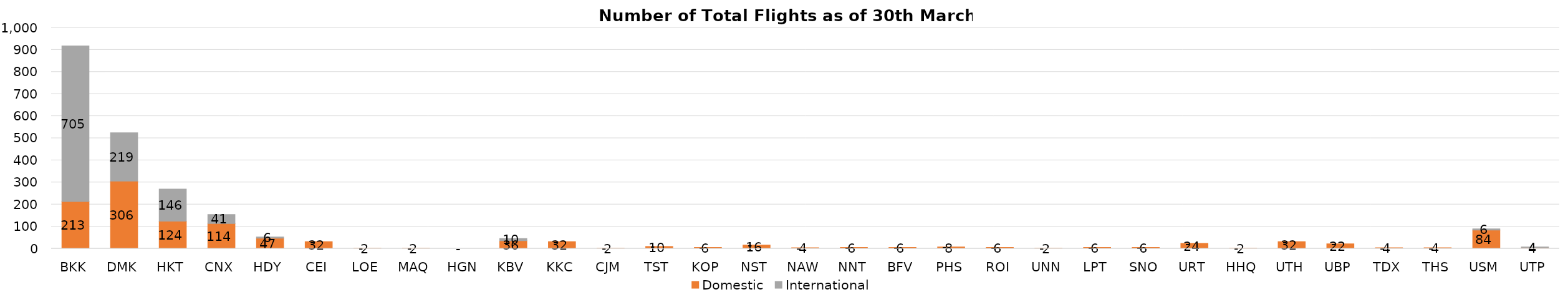
| Category | Domestic | International |
|---|---|---|
| BKK | 213 | 705 |
| DMK | 306 | 219 |
| HKT | 124 | 146 |
| CNX | 114 | 41 |
| HDY | 47 | 6 |
| CEI | 32 | 0 |
| LOE | 2 | 0 |
| MAQ | 2 | 0 |
| HGN | 0 | 0 |
| KBV | 36 | 10 |
| KKC | 32 | 0 |
| CJM | 2 | 0 |
| TST | 10 | 0 |
| KOP | 6 | 0 |
| NST | 16 | 0 |
| NAW | 4 | 0 |
| NNT | 6 | 0 |
| BFV | 6 | 0 |
| PHS | 8 | 0 |
| ROI | 6 | 0 |
| UNN | 2 | 0 |
| LPT | 6 | 0 |
| SNO | 6 | 0 |
| URT | 24 | 0 |
| HHQ | 2 | 0 |
| UTH | 32 | 0 |
| UBP | 22 | 0 |
| TDX | 4 | 0 |
| THS | 4 | 0 |
| USM | 84 | 6 |
| UTP | 4 | 4 |